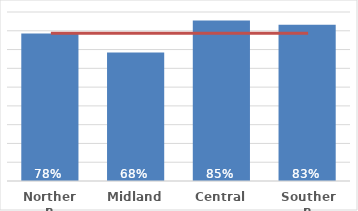
| Category | Total |
|---|---|
| Northern | 0.785 |
| Midland | 0.685 |
| Central | 0.854 |
| Southern | 0.832 |